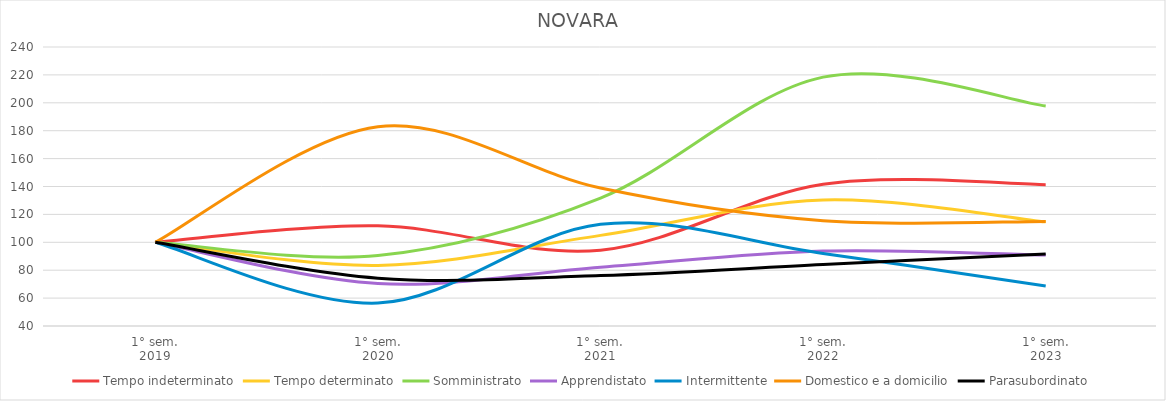
| Category | Tempo indeterminato | Tempo determinato | Somministrato | Apprendistato | Intermittente | Domestico e a domicilio | Parasubordinato |
|---|---|---|---|---|---|---|---|
| 1° sem.
2019 | 100 | 100 | 100 | 100 | 100 | 100 | 100 |
| 1° sem.
2020 | 111.788 | 83.404 | 90.596 | 70.417 | 56.442 | 182.872 | 74.316 |
| 1° sem.
2021 | 94.36 | 104.956 | 131.738 | 82.083 | 112.883 | 138.917 | 76.211 |
| 1° sem.
2022 | 141.624 | 130.388 | 218.388 | 93.75 | 92.025 | 115.491 | 84.105 |
| 1° sem.
2023 | 141.342 | 114.667 | 197.733 | 90.833 | 68.712 | 114.987 | 91.684 |